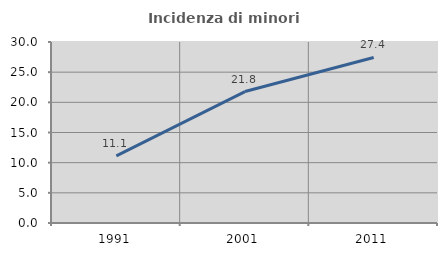
| Category | Incidenza di minori stranieri |
|---|---|
| 1991.0 | 11.111 |
| 2001.0 | 21.788 |
| 2011.0 | 27.434 |